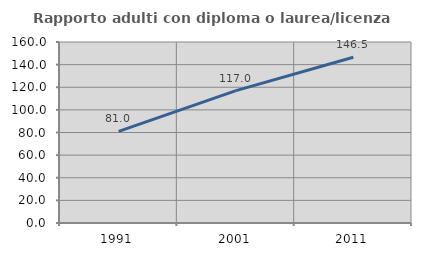
| Category | Rapporto adulti con diploma o laurea/licenza media  |
|---|---|
| 1991.0 | 81.02 |
| 2001.0 | 116.981 |
| 2011.0 | 146.518 |